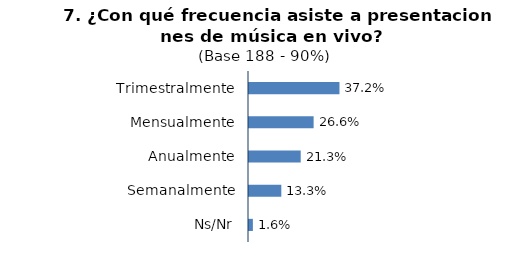
| Category | Series 0 |
|---|---|
| Trimestralmente | 0.372 |
| Mensualmente | 0.266 |
| Anualmente | 0.213 |
| Semanalmente | 0.133 |
| Ns/Nr | 0.016 |